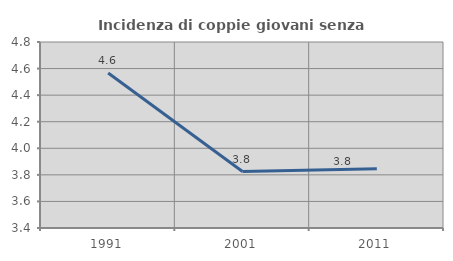
| Category | Incidenza di coppie giovani senza figli |
|---|---|
| 1991.0 | 4.566 |
| 2001.0 | 3.825 |
| 2011.0 | 3.846 |